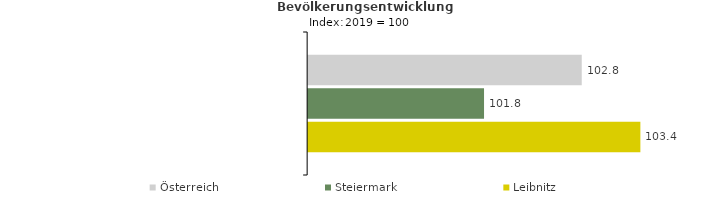
| Category | Österreich | Steiermark | Leibnitz |
|---|---|---|---|
| 2023.0 | 102.8 | 101.8 | 103.4 |